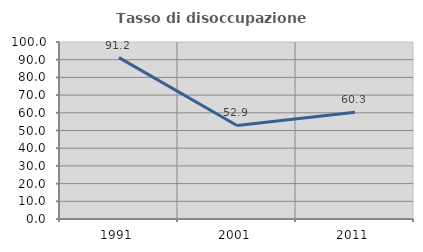
| Category | Tasso di disoccupazione giovanile  |
|---|---|
| 1991.0 | 91.153 |
| 2001.0 | 52.857 |
| 2011.0 | 60.294 |